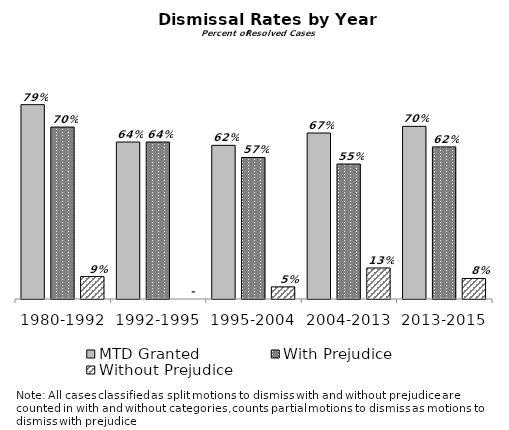
| Category | MTD Granted | With Prejudice | Without Prejudice |
|---|---|---|---|
| 1980-1992 | 0.788 | 0.697 | 0.091 |
| 1992-1995 | 0.636 | 0.636 | 0 |
| 1995-2004 | 0.623 | 0.574 | 0.049 |
| 2004-2013 | 0.673 | 0.547 | 0.126 |
| 2013-2015 | 0.7 | 0.617 | 0.083 |